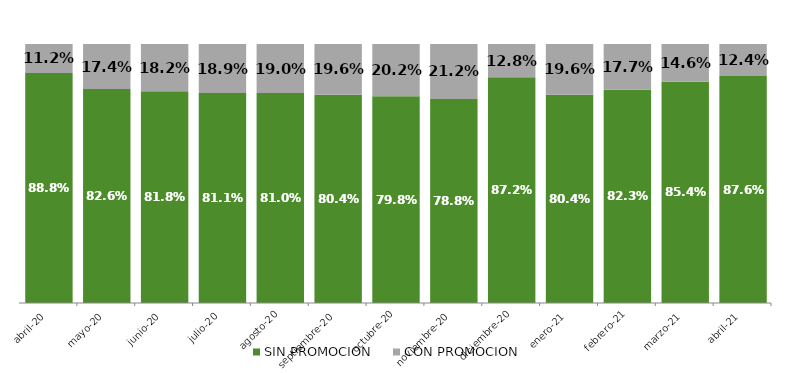
| Category | SIN PROMOCION   | CON PROMOCION   |
|---|---|---|
| 2020-04-01 | 0.888 | 0.112 |
| 2020-05-01 | 0.826 | 0.174 |
| 2020-06-01 | 0.818 | 0.182 |
| 2020-07-01 | 0.811 | 0.189 |
| 2020-08-01 | 0.81 | 0.19 |
| 2020-09-01 | 0.804 | 0.196 |
| 2020-10-01 | 0.798 | 0.202 |
| 2020-11-01 | 0.788 | 0.212 |
| 2020-12-01 | 0.872 | 0.128 |
| 2021-01-01 | 0.804 | 0.196 |
| 2021-02-01 | 0.823 | 0.177 |
| 2021-03-01 | 0.854 | 0.146 |
| 2021-04-01 | 0.876 | 0.124 |